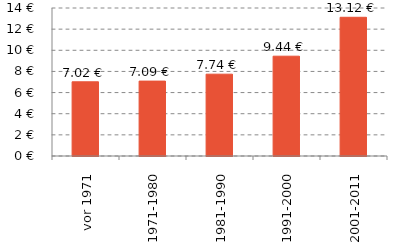
| Category | Series 0 |
|---|---|
| vor 1971 | 7.019 |
| 1971-1980 | 7.085 |
| 1981-1990 | 7.74 |
| 1991-2000 | 9.44 |
| 2001-2011 | 13.121 |